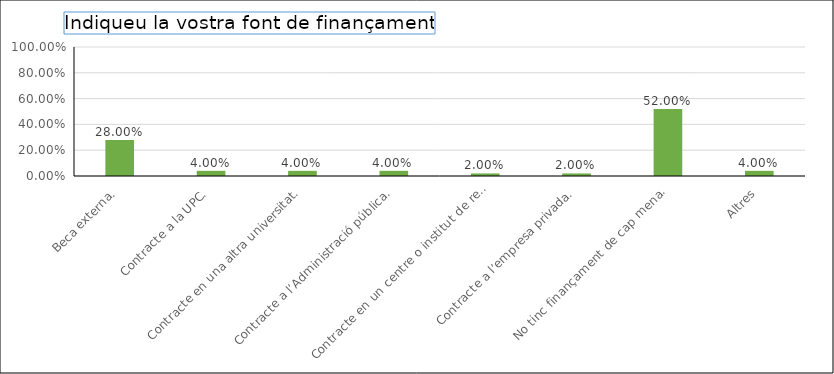
| Category | Series 0 |
|---|---|
| Beca externa. | 0.28 |
| Contracte a la UPC. | 0.04 |
| Contracte en una altra universitat. | 0.04 |
| Contracte a l’Administració pública. | 0.04 |
| Contracte en un centre o institut de recerca diferent de la UPC. | 0.02 |
| Contracte a l’empresa privada. | 0.02 |
| No tinc finançament de cap mena. | 0.52 |
| Altres | 0.04 |